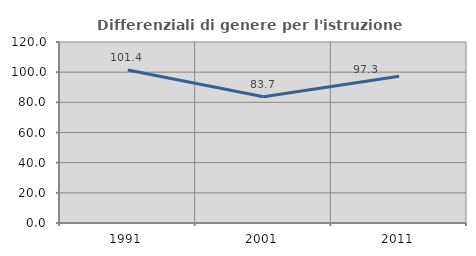
| Category | Differenziali di genere per l'istruzione superiore |
|---|---|
| 1991.0 | 101.412 |
| 2001.0 | 83.722 |
| 2011.0 | 97.299 |